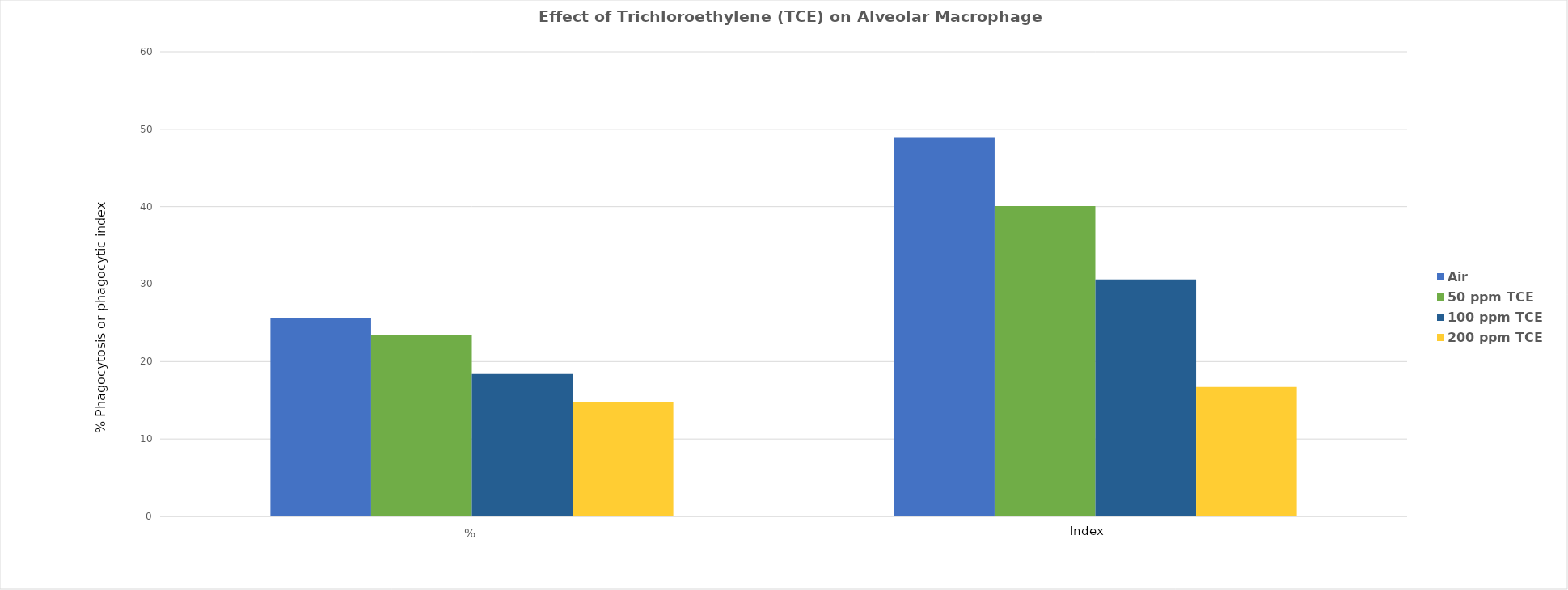
| Category | Air #REF! #REF! #REF! #REF! | 50 ppm TCE #REF! #REF! #REF! #REF! | 100 ppm TCE #REF! #REF! #REF! #REF! | 200 ppm TCE #REF! #REF! #REF! #REF! |
|---|---|---|---|---|
| % | 25.6 | 23.4 | 18.4 | 14.8 |